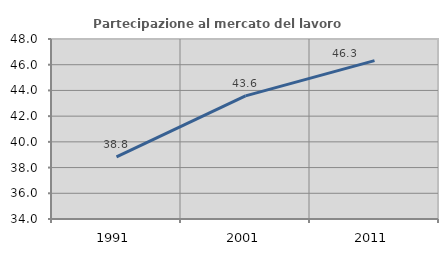
| Category | Partecipazione al mercato del lavoro  femminile |
|---|---|
| 1991.0 | 38.826 |
| 2001.0 | 43.576 |
| 2011.0 | 46.32 |